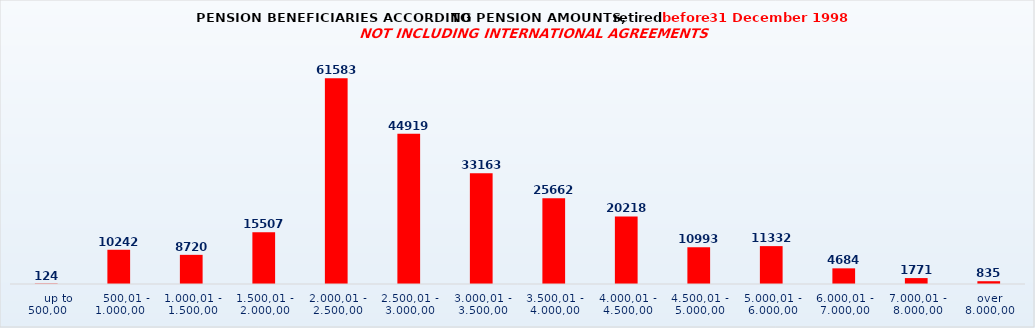
| Category | Series 0 |
|---|---|
|      up to 500,00 | 124 |
|    500,01 - 1.000,00 | 10242 |
| 1.000,01 - 1.500,00 | 8720 |
| 1.500,01 - 2.000,00 | 15507 |
| 2.000,01 - 2.500,00 | 61583 |
| 2.500,01 - 3.000,00 | 44919 |
| 3.000,01 - 3.500,00 | 33163 |
| 3.500,01 - 4.000,00 | 25662 |
| 4.000,01 - 4.500,00 | 20218 |
| 4.500,01 - 5.000,00 | 10993 |
| 5.000,01 - 6.000,00 | 11332 |
| 6.000,01 - 7.000,00 | 4684 |
| 7.000,01 - 8.000,00 | 1771 |
| over 8.000,00 | 835 |